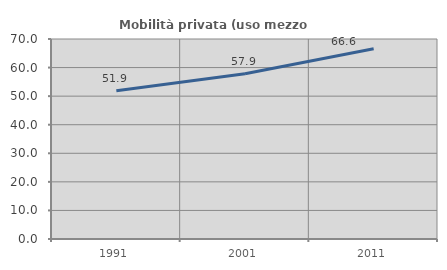
| Category | Mobilità privata (uso mezzo privato) |
|---|---|
| 1991.0 | 51.919 |
| 2001.0 | 57.859 |
| 2011.0 | 66.585 |